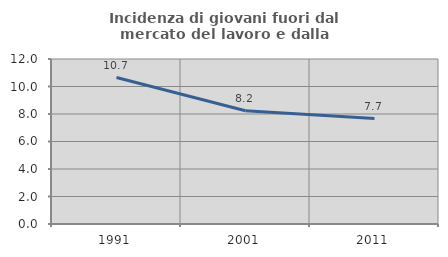
| Category | Incidenza di giovani fuori dal mercato del lavoro e dalla formazione  |
|---|---|
| 1991.0 | 10.651 |
| 2001.0 | 8.239 |
| 2011.0 | 7.664 |